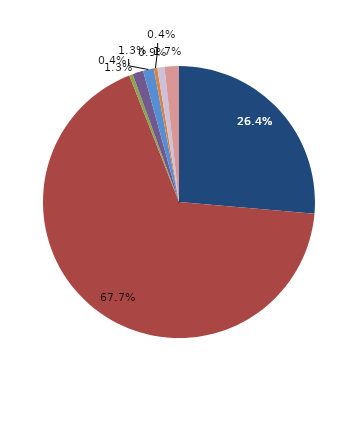
| Category | Series 0 |
|---|---|
| قبل الدخول | 26.383 |
| -1 | 67.66 |
| 1 | 0.426 |
| 2 | 1.277 |
| 3 | 1.277 |
| 4 | 0.426 |
|  5 - 9 | 0.851 |
| 10 - 14 | 1.702 |